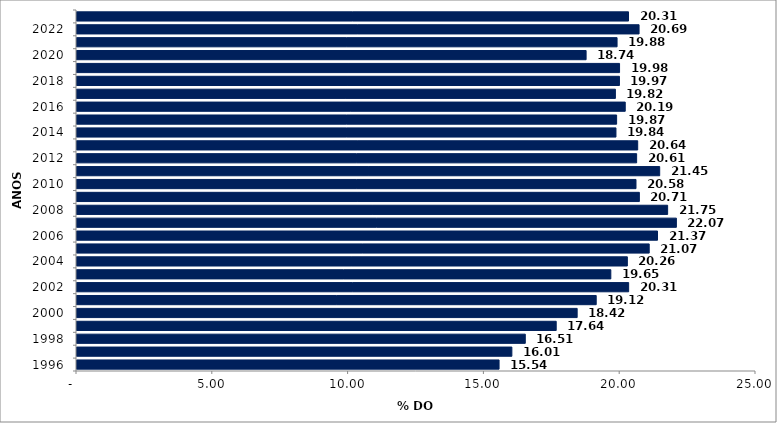
| Category | Series 0 |
|---|---|
| 1996 | 15.54 |
| 1997 | 16.011 |
| 1998 | 16.505 |
| 1999 | 17.644 |
| 2000 | 18.415 |
| 2001 | 19.117 |
| 2002 | 20.311 |
| 2003 | 19.654 |
| 2004 | 20.264 |
| 2005 | 21.068 |
| 2006 | 21.374 |
| 2007 | 22.069 |
| 2008 | 21.746 |
| 2009 | 20.706 |
| 2010 | 20.581 |
| 2011 | 21.454 |
| 2012 | 20.605 |
| 2013 | 20.644 |
| 2014 | 19.844 |
| 2015 | 19.868 |
| 2016 | 20.186 |
| 2017 | 19.823 |
| 2018 | 19.972 |
| 2019 | 19.976 |
| 2020 | 18.745 |
| 2021 | 19.885 |
| 2022 | 20.695 |
| 2023 | 20.306 |